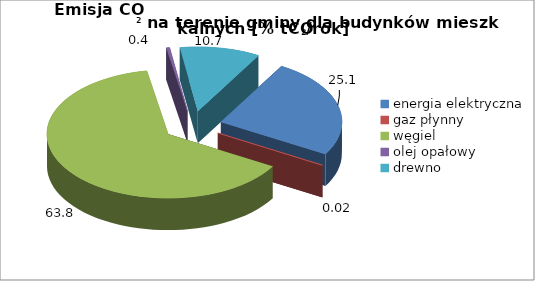
| Category | 25,1 0,02 63,8 0,4 10,7 |
|---|---|
| energia elektryczna | 25.053 |
| gaz płynny | 0.023 |
| węgiel | 63.783 |
| olej opałowy | 0.437 |
| drewno | 10.704 |